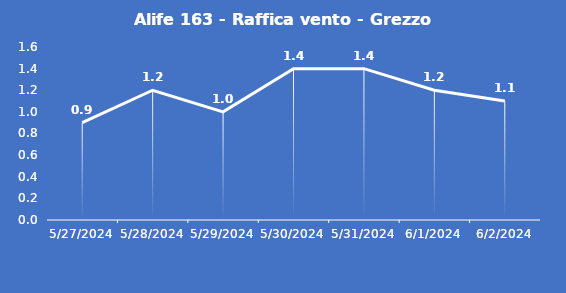
| Category | Alife 163 - Raffica vento - Grezzo (m/s) |
|---|---|
| 5/27/24 | 0.9 |
| 5/28/24 | 1.2 |
| 5/29/24 | 1 |
| 5/30/24 | 1.4 |
| 5/31/24 | 1.4 |
| 6/1/24 | 1.2 |
| 6/2/24 | 1.1 |